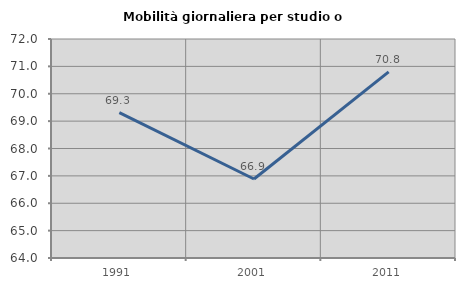
| Category | Mobilità giornaliera per studio o lavoro |
|---|---|
| 1991.0 | 69.31 |
| 2001.0 | 66.886 |
| 2011.0 | 70.799 |